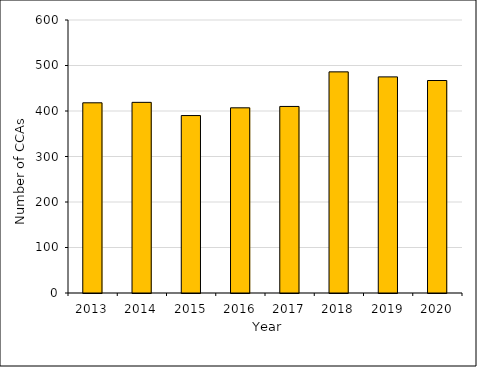
| Category | Series 0 |
|---|---|
| 2013.0 | 418 |
| 2014.0 | 419 |
| 2015.0 | 390 |
| 2016.0 | 407 |
| 2017.0 | 410 |
| 2018.0 | 486 |
| 2019.0 | 475 |
| 2020.0 | 467 |